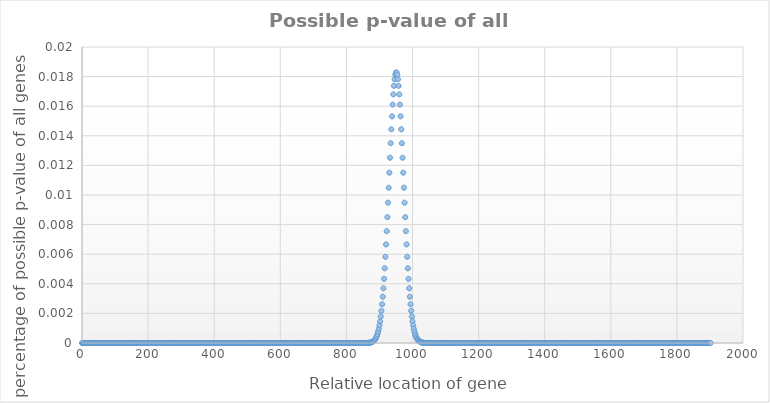
| Category | p-value of all |
|---|---|
| 0.0 | 0 |
| 2.0 | 0 |
| 4.0 | 0 |
| 6.0 | 0 |
| 8.0 | 0 |
| 10.0 | 0 |
| 12.0 | 0 |
| 14.0 | 0 |
| 16.0 | 0 |
| 18.0 | 0 |
| 20.0 | 0 |
| 22.0 | 0 |
| 24.0 | 0 |
| 26.0 | 0 |
| 28.0 | 0 |
| 30.0 | 0 |
| 32.0 | 0 |
| 34.0 | 0 |
| 36.0 | 0 |
| 38.0 | 0 |
| 40.0 | 0 |
| 42.0 | 0 |
| 44.0 | 0 |
| 46.0 | 0 |
| 48.0 | 0 |
| 50.0 | 0 |
| 52.0 | 0 |
| 54.0 | 0 |
| 56.0 | 0 |
| 58.0 | 0 |
| 60.0 | 0 |
| 62.0 | 0 |
| 64.0 | 0 |
| 66.0 | 0 |
| 68.0 | 0 |
| 70.0 | 0 |
| 72.0 | 0 |
| 74.0 | 0 |
| 76.0 | 0 |
| 78.0 | 0 |
| 80.0 | 0 |
| 82.0 | 0 |
| 84.0 | 0 |
| 86.0 | 0 |
| 88.0 | 0 |
| 90.0 | 0 |
| 92.0 | 0 |
| 94.0 | 0 |
| 96.0 | 0 |
| 98.0 | 0 |
| 100.0 | 0 |
| 102.0 | 0 |
| 104.0 | 0 |
| 106.0 | 0 |
| 108.0 | 0 |
| 110.0 | 0 |
| 112.0 | 0 |
| 114.0 | 0 |
| 116.0 | 0 |
| 118.0 | 0 |
| 120.0 | 0 |
| 122.0 | 0 |
| 124.0 | 0 |
| 126.0 | 0 |
| 128.0 | 0 |
| 130.0 | 0 |
| 132.0 | 0 |
| 134.0 | 0 |
| 136.0 | 0 |
| 138.0 | 0 |
| 140.0 | 0 |
| 142.0 | 0 |
| 144.0 | 0 |
| 146.0 | 0 |
| 148.0 | 0 |
| 150.0 | 0 |
| 152.0 | 0 |
| 154.0 | 0 |
| 156.0 | 0 |
| 158.0 | 0 |
| 160.0 | 0 |
| 162.0 | 0 |
| 164.0 | 0 |
| 166.0 | 0 |
| 168.0 | 0 |
| 170.0 | 0 |
| 172.0 | 0 |
| 174.0 | 0 |
| 176.0 | 0 |
| 178.0 | 0 |
| 180.0 | 0 |
| 182.0 | 0 |
| 184.0 | 0 |
| 186.0 | 0 |
| 188.0 | 0 |
| 190.0 | 0 |
| 192.0 | 0 |
| 194.0 | 0 |
| 196.0 | 0 |
| 198.0 | 0 |
| 200.0 | 0 |
| 202.0 | 0 |
| 204.0 | 0 |
| 206.0 | 0 |
| 208.0 | 0 |
| 210.0 | 0 |
| 212.0 | 0 |
| 214.0 | 0 |
| 216.0 | 0 |
| 218.0 | 0 |
| 220.0 | 0 |
| 222.0 | 0 |
| 224.0 | 0 |
| 226.0 | 0 |
| 228.0 | 0 |
| 230.0 | 0 |
| 232.0 | 0 |
| 234.0 | 0 |
| 236.0 | 0 |
| 238.0 | 0 |
| 240.0 | 0 |
| 242.0 | 0 |
| 244.0 | 0 |
| 246.0 | 0 |
| 248.0 | 0 |
| 250.0 | 0 |
| 252.0 | 0 |
| 254.0 | 0 |
| 256.0 | 0 |
| 258.0 | 0 |
| 260.0 | 0 |
| 262.0 | 0 |
| 264.0 | 0 |
| 266.0 | 0 |
| 268.0 | 0 |
| 270.0 | 0 |
| 272.0 | 0 |
| 274.0 | 0 |
| 276.0 | 0 |
| 278.0 | 0 |
| 280.0 | 0 |
| 282.0 | 0 |
| 284.0 | 0 |
| 286.0 | 0 |
| 288.0 | 0 |
| 290.0 | 0 |
| 292.0 | 0 |
| 294.0 | 0 |
| 296.0 | 0 |
| 298.0 | 0 |
| 300.0 | 0 |
| 302.0 | 0 |
| 304.0 | 0 |
| 306.0 | 0 |
| 308.0 | 0 |
| 310.0 | 0 |
| 312.0 | 0 |
| 314.0 | 0 |
| 316.0 | 0 |
| 318.0 | 0 |
| 320.0 | 0 |
| 322.0 | 0 |
| 324.0 | 0 |
| 326.0 | 0 |
| 328.0 | 0 |
| 330.0 | 0 |
| 332.0 | 0 |
| 334.0 | 0 |
| 336.0 | 0 |
| 338.0 | 0 |
| 340.0 | 0 |
| 342.0 | 0 |
| 344.0 | 0 |
| 346.0 | 0 |
| 348.0 | 0 |
| 350.0 | 0 |
| 352.0 | 0 |
| 354.0 | 0 |
| 356.0 | 0 |
| 358.0 | 0 |
| 360.0 | 0 |
| 362.0 | 0 |
| 364.0 | 0 |
| 366.0 | 0 |
| 368.0 | 0 |
| 370.0 | 0 |
| 372.0 | 0 |
| 374.0 | 0 |
| 376.0 | 0 |
| 378.0 | 0 |
| 380.0 | 0 |
| 382.0 | 0 |
| 384.0 | 0 |
| 386.0 | 0 |
| 388.0 | 0 |
| 390.0 | 0 |
| 392.0 | 0 |
| 394.0 | 0 |
| 396.0 | 0 |
| 398.0 | 0 |
| 400.0 | 0 |
| 402.0 | 0 |
| 404.0 | 0 |
| 406.0 | 0 |
| 408.0 | 0 |
| 410.0 | 0 |
| 412.0 | 0 |
| 414.0 | 0 |
| 416.0 | 0 |
| 418.0 | 0 |
| 420.0 | 0 |
| 422.0 | 0 |
| 424.0 | 0 |
| 426.0 | 0 |
| 428.0 | 0 |
| 430.0 | 0 |
| 432.0 | 0 |
| 434.0 | 0 |
| 436.0 | 0 |
| 438.0 | 0 |
| 440.0 | 0 |
| 442.0 | 0 |
| 444.0 | 0 |
| 446.0 | 0 |
| 448.0 | 0 |
| 450.0 | 0 |
| 452.0 | 0 |
| 454.0 | 0 |
| 456.0 | 0 |
| 458.0 | 0 |
| 460.0 | 0 |
| 462.0 | 0 |
| 464.0 | 0 |
| 466.0 | 0 |
| 468.0 | 0 |
| 470.0 | 0 |
| 472.0 | 0 |
| 474.0 | 0 |
| 476.0 | 0 |
| 478.0 | 0 |
| 480.0 | 0 |
| 482.0 | 0 |
| 484.0 | 0 |
| 486.0 | 0 |
| 488.0 | 0 |
| 490.0 | 0 |
| 492.0 | 0 |
| 494.0 | 0 |
| 496.0 | 0 |
| 498.0 | 0 |
| 500.0 | 0 |
| 502.0 | 0 |
| 504.0 | 0 |
| 506.0 | 0 |
| 508.0 | 0 |
| 510.0 | 0 |
| 512.0 | 0 |
| 514.0 | 0 |
| 516.0 | 0 |
| 518.0 | 0 |
| 520.0 | 0 |
| 522.0 | 0 |
| 524.0 | 0 |
| 526.0 | 0 |
| 528.0 | 0 |
| 530.0 | 0 |
| 532.0 | 0 |
| 534.0 | 0 |
| 536.0 | 0 |
| 538.0 | 0 |
| 540.0 | 0 |
| 542.0 | 0 |
| 544.0 | 0 |
| 546.0 | 0 |
| 548.0 | 0 |
| 550.0 | 0 |
| 552.0 | 0 |
| 554.0 | 0 |
| 556.0 | 0 |
| 558.0 | 0 |
| 560.0 | 0 |
| 562.0 | 0 |
| 564.0 | 0 |
| 566.0 | 0 |
| 568.0 | 0 |
| 570.0 | 0 |
| 572.0 | 0 |
| 574.0 | 0 |
| 576.0 | 0 |
| 578.0 | 0 |
| 580.0 | 0 |
| 582.0 | 0 |
| 584.0 | 0 |
| 586.0 | 0 |
| 588.0 | 0 |
| 590.0 | 0 |
| 592.0 | 0 |
| 594.0 | 0 |
| 596.0 | 0 |
| 598.0 | 0 |
| 600.0 | 0 |
| 602.0 | 0 |
| 604.0 | 0 |
| 606.0 | 0 |
| 608.0 | 0 |
| 610.0 | 0 |
| 612.0 | 0 |
| 614.0 | 0 |
| 616.0 | 0 |
| 618.0 | 0 |
| 620.0 | 0 |
| 622.0 | 0 |
| 624.0 | 0 |
| 626.0 | 0 |
| 628.0 | 0 |
| 630.0 | 0 |
| 632.0 | 0 |
| 634.0 | 0 |
| 636.0 | 0 |
| 638.0 | 0 |
| 640.0 | 0 |
| 642.0 | 0 |
| 644.0 | 0 |
| 646.0 | 0 |
| 648.0 | 0 |
| 650.0 | 0 |
| 652.0 | 0 |
| 654.0 | 0 |
| 656.0 | 0 |
| 658.0 | 0 |
| 660.0 | 0 |
| 662.0 | 0 |
| 664.0 | 0 |
| 666.0 | 0 |
| 668.0 | 0 |
| 670.0 | 0 |
| 672.0 | 0 |
| 674.0 | 0 |
| 676.0 | 0 |
| 678.0 | 0 |
| 680.0 | 0 |
| 682.0 | 0 |
| 684.0 | 0 |
| 686.0 | 0 |
| 688.0 | 0 |
| 690.0 | 0 |
| 692.0 | 0 |
| 694.0 | 0 |
| 696.0 | 0 |
| 698.0 | 0 |
| 700.0 | 0 |
| 702.0 | 0 |
| 704.0 | 0 |
| 706.0 | 0 |
| 708.0 | 0 |
| 710.0 | 0 |
| 712.0 | 0 |
| 714.0 | 0 |
| 716.0 | 0 |
| 718.0 | 0 |
| 720.0 | 0 |
| 722.0 | 0 |
| 724.0 | 0 |
| 726.0 | 0 |
| 728.0 | 0 |
| 730.0 | 0 |
| 732.0 | 0 |
| 734.0 | 0 |
| 736.0 | 0 |
| 738.0 | 0 |
| 740.0 | 0 |
| 742.0 | 0 |
| 744.0 | 0 |
| 746.0 | 0 |
| 748.0 | 0 |
| 750.0 | 0 |
| 752.0 | 0 |
| 754.0 | 0 |
| 756.0 | 0 |
| 758.0 | 0 |
| 760.0 | 0 |
| 762.0 | 0 |
| 764.0 | 0 |
| 766.0 | 0 |
| 768.0 | 0 |
| 770.0 | 0 |
| 772.0 | 0 |
| 774.0 | 0 |
| 776.0 | 0 |
| 778.0 | 0 |
| 780.0 | 0 |
| 782.0 | 0 |
| 784.0 | 0 |
| 786.0 | 0 |
| 788.0 | 0 |
| 790.0 | 0 |
| 792.0 | 0 |
| 794.0 | 0 |
| 796.0 | 0 |
| 798.0 | 0 |
| 800.0 | 0 |
| 802.0 | 0 |
| 804.0 | 0 |
| 806.0 | 0 |
| 808.0 | 0 |
| 810.0 | 0 |
| 812.0 | 0 |
| 814.0 | 0 |
| 816.0 | 0 |
| 818.0 | 0 |
| 820.0 | 0 |
| 822.0 | 0 |
| 824.0 | 0 |
| 826.0 | 0 |
| 828.0 | 0 |
| 830.0 | 0 |
| 832.0 | 0 |
| 834.0 | 0 |
| 836.0 | 0 |
| 838.0 | 0 |
| 840.0 | 0 |
| 842.0 | 0 |
| 844.0 | 0 |
| 846.0 | 0 |
| 848.0 | 0 |
| 850.0 | 0 |
| 852.0 | 0 |
| 854.0 | 0 |
| 856.0 | 0 |
| 858.0 | 0 |
| 860.0 | 0 |
| 862.0 | 0 |
| 864.0 | 0 |
| 866.0 | 0 |
| 868.0 | 0 |
| 870.0 | 0 |
| 872.0 | 0 |
| 874.0 | 0 |
| 876.0 | 0 |
| 878.0 | 0 |
| 880.0 | 0 |
| 882.0 | 0 |
| 884.0 | 0 |
| 886.0 | 0 |
| 888.0 | 0 |
| 890.0 | 0 |
| 892.0 | 0 |
| 894.0 | 0.001 |
| 896.0 | 0.001 |
| 898.0 | 0.001 |
| 900.0 | 0.001 |
| 902.0 | 0.001 |
| 904.0 | 0.002 |
| 906.0 | 0.002 |
| 908.0 | 0.003 |
| 910.0 | 0.003 |
| 912.0 | 0.004 |
| 914.0 | 0.004 |
| 916.0 | 0.005 |
| 918.0 | 0.006 |
| 920.0 | 0.007 |
| 922.0 | 0.008 |
| 924.0 | 0.009 |
| 926.0 | 0.009 |
| 928.0 | 0.01 |
| 930.0 | 0.012 |
| 932.0 | 0.013 |
| 934.0 | 0.014 |
| 936.0 | 0.014 |
| 938.0 | 0.015 |
| 940.0 | 0.016 |
| 942.0 | 0.017 |
| 944.0 | 0.017 |
| 946.0 | 0.018 |
| 948.0 | 0.018 |
| 950.0 | 0.018 |
| 952.0 | 0.018 |
| 954.0 | 0.018 |
| 956.0 | 0.018 |
| 958.0 | 0.017 |
| 960.0 | 0.017 |
| 962.0 | 0.016 |
| 964.0 | 0.015 |
| 966.0 | 0.014 |
| 968.0 | 0.014 |
| 970.0 | 0.013 |
| 972.0 | 0.012 |
| 974.0 | 0.01 |
| 976.0 | 0.009 |
| 978.0 | 0.009 |
| 980.0 | 0.008 |
| 982.0 | 0.007 |
| 984.0 | 0.006 |
| 986.0 | 0.005 |
| 988.0 | 0.004 |
| 990.0 | 0.004 |
| 992.0 | 0.003 |
| 994.0 | 0.003 |
| 996.0 | 0.002 |
| 998.0 | 0.002 |
| 1000.0 | 0.001 |
| 1002.0 | 0.001 |
| 1004.0 | 0.001 |
| 1006.0 | 0.001 |
| 1008.0 | 0.001 |
| 1010.0 | 0 |
| 1012.0 | 0 |
| 1014.0 | 0 |
| 1016.0 | 0 |
| 1018.0 | 0 |
| 1020.0 | 0 |
| 1022.0 | 0 |
| 1024.0 | 0 |
| 1026.0 | 0 |
| 1028.0 | 0 |
| 1030.0 | 0 |
| 1032.0 | 0 |
| 1034.0 | 0 |
| 1036.0 | 0 |
| 1038.0 | 0 |
| 1040.0 | 0 |
| 1042.0 | 0 |
| 1044.0 | 0 |
| 1046.0 | 0 |
| 1048.0 | 0 |
| 1050.0 | 0 |
| 1052.0 | 0 |
| 1054.0 | 0 |
| 1056.0 | 0 |
| 1058.0 | 0 |
| 1060.0 | 0 |
| 1062.0 | 0 |
| 1064.0 | 0 |
| 1066.0 | 0 |
| 1068.0 | 0 |
| 1070.0 | 0 |
| 1072.0 | 0 |
| 1074.0 | 0 |
| 1076.0 | 0 |
| 1078.0 | 0 |
| 1080.0 | 0 |
| 1082.0 | 0 |
| 1084.0 | 0 |
| 1086.0 | 0 |
| 1088.0 | 0 |
| 1090.0 | 0 |
| 1092.0 | 0 |
| 1094.0 | 0 |
| 1096.0 | 0 |
| 1098.0 | 0 |
| 1100.0 | 0 |
| 1102.0 | 0 |
| 1104.0 | 0 |
| 1106.0 | 0 |
| 1108.0 | 0 |
| 1110.0 | 0 |
| 1112.0 | 0 |
| 1114.0 | 0 |
| 1116.0 | 0 |
| 1118.0 | 0 |
| 1120.0 | 0 |
| 1122.0 | 0 |
| 1124.0 | 0 |
| 1126.0 | 0 |
| 1128.0 | 0 |
| 1130.0 | 0 |
| 1132.0 | 0 |
| 1134.0 | 0 |
| 1136.0 | 0 |
| 1138.0 | 0 |
| 1140.0 | 0 |
| 1142.0 | 0 |
| 1144.0 | 0 |
| 1146.0 | 0 |
| 1148.0 | 0 |
| 1150.0 | 0 |
| 1152.0 | 0 |
| 1154.0 | 0 |
| 1156.0 | 0 |
| 1158.0 | 0 |
| 1160.0 | 0 |
| 1162.0 | 0 |
| 1164.0 | 0 |
| 1166.0 | 0 |
| 1168.0 | 0 |
| 1170.0 | 0 |
| 1172.0 | 0 |
| 1174.0 | 0 |
| 1176.0 | 0 |
| 1178.0 | 0 |
| 1180.0 | 0 |
| 1182.0 | 0 |
| 1184.0 | 0 |
| 1186.0 | 0 |
| 1188.0 | 0 |
| 1190.0 | 0 |
| 1192.0 | 0 |
| 1194.0 | 0 |
| 1196.0 | 0 |
| 1198.0 | 0 |
| 1200.0 | 0 |
| 1202.0 | 0 |
| 1204.0 | 0 |
| 1206.0 | 0 |
| 1208.0 | 0 |
| 1210.0 | 0 |
| 1212.0 | 0 |
| 1214.0 | 0 |
| 1216.0 | 0 |
| 1218.0 | 0 |
| 1220.0 | 0 |
| 1222.0 | 0 |
| 1224.0 | 0 |
| 1226.0 | 0 |
| 1228.0 | 0 |
| 1230.0 | 0 |
| 1232.0 | 0 |
| 1234.0 | 0 |
| 1236.0 | 0 |
| 1238.0 | 0 |
| 1240.0 | 0 |
| 1242.0 | 0 |
| 1244.0 | 0 |
| 1246.0 | 0 |
| 1248.0 | 0 |
| 1250.0 | 0 |
| 1252.0 | 0 |
| 1254.0 | 0 |
| 1256.0 | 0 |
| 1258.0 | 0 |
| 1260.0 | 0 |
| 1262.0 | 0 |
| 1264.0 | 0 |
| 1266.0 | 0 |
| 1268.0 | 0 |
| 1270.0 | 0 |
| 1272.0 | 0 |
| 1274.0 | 0 |
| 1276.0 | 0 |
| 1278.0 | 0 |
| 1280.0 | 0 |
| 1282.0 | 0 |
| 1284.0 | 0 |
| 1286.0 | 0 |
| 1288.0 | 0 |
| 1290.0 | 0 |
| 1292.0 | 0 |
| 1294.0 | 0 |
| 1296.0 | 0 |
| 1298.0 | 0 |
| 1300.0 | 0 |
| 1302.0 | 0 |
| 1304.0 | 0 |
| 1306.0 | 0 |
| 1308.0 | 0 |
| 1310.0 | 0 |
| 1312.0 | 0 |
| 1314.0 | 0 |
| 1316.0 | 0 |
| 1318.0 | 0 |
| 1320.0 | 0 |
| 1322.0 | 0 |
| 1324.0 | 0 |
| 1326.0 | 0 |
| 1328.0 | 0 |
| 1330.0 | 0 |
| 1332.0 | 0 |
| 1334.0 | 0 |
| 1336.0 | 0 |
| 1338.0 | 0 |
| 1340.0 | 0 |
| 1342.0 | 0 |
| 1344.0 | 0 |
| 1346.0 | 0 |
| 1348.0 | 0 |
| 1350.0 | 0 |
| 1352.0 | 0 |
| 1354.0 | 0 |
| 1356.0 | 0 |
| 1358.0 | 0 |
| 1360.0 | 0 |
| 1362.0 | 0 |
| 1364.0 | 0 |
| 1366.0 | 0 |
| 1368.0 | 0 |
| 1370.0 | 0 |
| 1372.0 | 0 |
| 1374.0 | 0 |
| 1376.0 | 0 |
| 1378.0 | 0 |
| 1380.0 | 0 |
| 1382.0 | 0 |
| 1384.0 | 0 |
| 1386.0 | 0 |
| 1388.0 | 0 |
| 1390.0 | 0 |
| 1392.0 | 0 |
| 1394.0 | 0 |
| 1396.0 | 0 |
| 1398.0 | 0 |
| 1400.0 | 0 |
| 1402.0 | 0 |
| 1404.0 | 0 |
| 1406.0 | 0 |
| 1408.0 | 0 |
| 1410.0 | 0 |
| 1412.0 | 0 |
| 1414.0 | 0 |
| 1416.0 | 0 |
| 1418.0 | 0 |
| 1420.0 | 0 |
| 1422.0 | 0 |
| 1424.0 | 0 |
| 1426.0 | 0 |
| 1428.0 | 0 |
| 1430.0 | 0 |
| 1432.0 | 0 |
| 1434.0 | 0 |
| 1436.0 | 0 |
| 1438.0 | 0 |
| 1440.0 | 0 |
| 1442.0 | 0 |
| 1444.0 | 0 |
| 1446.0 | 0 |
| 1448.0 | 0 |
| 1450.0 | 0 |
| 1452.0 | 0 |
| 1454.0 | 0 |
| 1456.0 | 0 |
| 1458.0 | 0 |
| 1460.0 | 0 |
| 1462.0 | 0 |
| 1464.0 | 0 |
| 1466.0 | 0 |
| 1468.0 | 0 |
| 1470.0 | 0 |
| 1472.0 | 0 |
| 1474.0 | 0 |
| 1476.0 | 0 |
| 1478.0 | 0 |
| 1480.0 | 0 |
| 1482.0 | 0 |
| 1484.0 | 0 |
| 1486.0 | 0 |
| 1488.0 | 0 |
| 1490.0 | 0 |
| 1492.0 | 0 |
| 1494.0 | 0 |
| 1496.0 | 0 |
| 1498.0 | 0 |
| 1500.0 | 0 |
| 1502.0 | 0 |
| 1504.0 | 0 |
| 1506.0 | 0 |
| 1508.0 | 0 |
| 1510.0 | 0 |
| 1512.0 | 0 |
| 1514.0 | 0 |
| 1516.0 | 0 |
| 1518.0 | 0 |
| 1520.0 | 0 |
| 1522.0 | 0 |
| 1524.0 | 0 |
| 1526.0 | 0 |
| 1528.0 | 0 |
| 1530.0 | 0 |
| 1532.0 | 0 |
| 1534.0 | 0 |
| 1536.0 | 0 |
| 1538.0 | 0 |
| 1540.0 | 0 |
| 1542.0 | 0 |
| 1544.0 | 0 |
| 1546.0 | 0 |
| 1548.0 | 0 |
| 1550.0 | 0 |
| 1552.0 | 0 |
| 1554.0 | 0 |
| 1556.0 | 0 |
| 1558.0 | 0 |
| 1560.0 | 0 |
| 1562.0 | 0 |
| 1564.0 | 0 |
| 1566.0 | 0 |
| 1568.0 | 0 |
| 1570.0 | 0 |
| 1572.0 | 0 |
| 1574.0 | 0 |
| 1576.0 | 0 |
| 1578.0 | 0 |
| 1580.0 | 0 |
| 1582.0 | 0 |
| 1584.0 | 0 |
| 1586.0 | 0 |
| 1588.0 | 0 |
| 1590.0 | 0 |
| 1592.0 | 0 |
| 1594.0 | 0 |
| 1596.0 | 0 |
| 1598.0 | 0 |
| 1600.0 | 0 |
| 1602.0 | 0 |
| 1604.0 | 0 |
| 1606.0 | 0 |
| 1608.0 | 0 |
| 1610.0 | 0 |
| 1612.0 | 0 |
| 1614.0 | 0 |
| 1616.0 | 0 |
| 1618.0 | 0 |
| 1620.0 | 0 |
| 1622.0 | 0 |
| 1624.0 | 0 |
| 1626.0 | 0 |
| 1628.0 | 0 |
| 1630.0 | 0 |
| 1632.0 | 0 |
| 1634.0 | 0 |
| 1636.0 | 0 |
| 1638.0 | 0 |
| 1640.0 | 0 |
| 1642.0 | 0 |
| 1644.0 | 0 |
| 1646.0 | 0 |
| 1648.0 | 0 |
| 1650.0 | 0 |
| 1652.0 | 0 |
| 1654.0 | 0 |
| 1656.0 | 0 |
| 1658.0 | 0 |
| 1660.0 | 0 |
| 1662.0 | 0 |
| 1664.0 | 0 |
| 1666.0 | 0 |
| 1668.0 | 0 |
| 1670.0 | 0 |
| 1672.0 | 0 |
| 1674.0 | 0 |
| 1676.0 | 0 |
| 1678.0 | 0 |
| 1680.0 | 0 |
| 1682.0 | 0 |
| 1684.0 | 0 |
| 1686.0 | 0 |
| 1688.0 | 0 |
| 1690.0 | 0 |
| 1692.0 | 0 |
| 1694.0 | 0 |
| 1696.0 | 0 |
| 1698.0 | 0 |
| 1700.0 | 0 |
| 1702.0 | 0 |
| 1704.0 | 0 |
| 1706.0 | 0 |
| 1708.0 | 0 |
| 1710.0 | 0 |
| 1712.0 | 0 |
| 1714.0 | 0 |
| 1716.0 | 0 |
| 1718.0 | 0 |
| 1720.0 | 0 |
| 1722.0 | 0 |
| 1724.0 | 0 |
| 1726.0 | 0 |
| 1728.0 | 0 |
| 1730.0 | 0 |
| 1732.0 | 0 |
| 1734.0 | 0 |
| 1736.0 | 0 |
| 1738.0 | 0 |
| 1740.0 | 0 |
| 1742.0 | 0 |
| 1744.0 | 0 |
| 1746.0 | 0 |
| 1748.0 | 0 |
| 1750.0 | 0 |
| 1752.0 | 0 |
| 1754.0 | 0 |
| 1756.0 | 0 |
| 1758.0 | 0 |
| 1760.0 | 0 |
| 1762.0 | 0 |
| 1764.0 | 0 |
| 1766.0 | 0 |
| 1768.0 | 0 |
| 1770.0 | 0 |
| 1772.0 | 0 |
| 1774.0 | 0 |
| 1776.0 | 0 |
| 1778.0 | 0 |
| 1780.0 | 0 |
| 1782.0 | 0 |
| 1784.0 | 0 |
| 1786.0 | 0 |
| 1788.0 | 0 |
| 1790.0 | 0 |
| 1792.0 | 0 |
| 1794.0 | 0 |
| 1796.0 | 0 |
| 1798.0 | 0 |
| 1800.0 | 0 |
| 1802.0 | 0 |
| 1804.0 | 0 |
| 1806.0 | 0 |
| 1808.0 | 0 |
| 1810.0 | 0 |
| 1812.0 | 0 |
| 1814.0 | 0 |
| 1816.0 | 0 |
| 1818.0 | 0 |
| 1820.0 | 0 |
| 1822.0 | 0 |
| 1824.0 | 0 |
| 1826.0 | 0 |
| 1828.0 | 0 |
| 1830.0 | 0 |
| 1832.0 | 0 |
| 1834.0 | 0 |
| 1836.0 | 0 |
| 1838.0 | 0 |
| 1840.0 | 0 |
| 1842.0 | 0 |
| 1844.0 | 0 |
| 1846.0 | 0 |
| 1848.0 | 0 |
| 1850.0 | 0 |
| 1852.0 | 0 |
| 1854.0 | 0 |
| 1856.0 | 0 |
| 1858.0 | 0 |
| 1860.0 | 0 |
| 1862.0 | 0 |
| 1864.0 | 0 |
| 1866.0 | 0 |
| 1868.0 | 0 |
| 1870.0 | 0 |
| 1872.0 | 0 |
| 1874.0 | 0 |
| 1876.0 | 0 |
| 1878.0 | 0 |
| 1880.0 | 0 |
| 1882.0 | 0 |
| 1884.0 | 0 |
| 1886.0 | 0 |
| 1888.0 | 0 |
| 1890.0 | 0 |
| 1892.0 | 0 |
| 1894.0 | 0 |
| 1896.0 | 0 |
| 1898.0 | 0 |
| 1900.0 | 0 |
| 1902.0 | 0 |